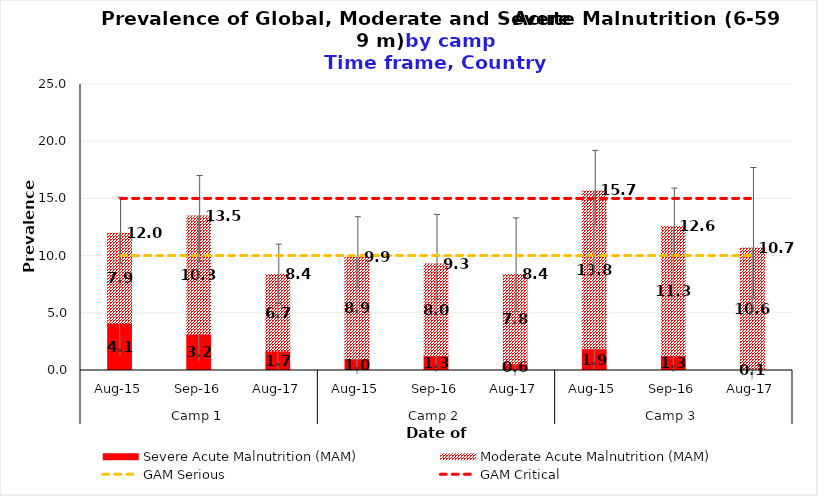
| Category | Severe Acute Malnutrition (MAM) | Moderate Acute Malnutrition (MAM) |
|---|---|---|
| 0 | 4.1 | 7.9 |
| 1 | 3.2 | 10.3 |
| 2 | 1.7 | 6.7 |
| 3 | 1 | 8.9 |
| 4 | 1.3 | 8 |
| 5 | 0.6 | 7.8 |
| 6 | 1.9 | 13.8 |
| 7 | 1.3 | 11.3 |
| 8 | 0.1 | 10.6 |